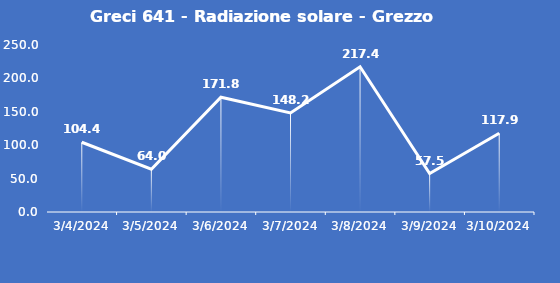
| Category | Greci 641 - Radiazione solare - Grezzo (W/m2) |
|---|---|
| 3/4/24 | 104.4 |
| 3/5/24 | 64 |
| 3/6/24 | 171.8 |
| 3/7/24 | 148.2 |
| 3/8/24 | 217.4 |
| 3/9/24 | 57.5 |
| 3/10/24 | 117.9 |